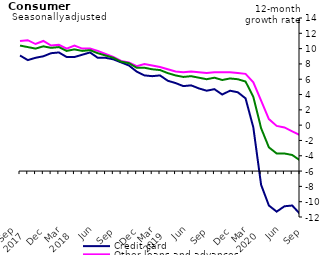
| Category | Credit card | Other loans and advances | Total |
|---|---|---|---|
| Sep 
2017 | 9.1 | 11 | 10.4 |
|  | 8.5 | 11.1 | 10.2 |
|  | 8.8 | 10.6 | 10 |
| Dec | 9 | 11 | 10.3 |
|  | 9.4 | 10.4 | 10.1 |
|  | 9.5 | 10.5 | 10.2 |
| Mar 
2018 | 8.9 | 10 | 9.7 |
|  | 8.9 | 10.4 | 9.9 |
|  | 9.2 | 10 | 9.7 |
| Jun | 9.5 | 10 | 9.8 |
|  | 8.8 | 9.7 | 9.4 |
|  | 8.8 | 9.3 | 9.1 |
| Sep | 8.6 | 8.9 | 8.8 |
|  | 8.2 | 8.4 | 8.3 |
|  | 7.8 | 8.2 | 8.1 |
| Dec | 7 | 7.7 | 7.5 |
|  | 6.5 | 8 | 7.5 |
|  | 6.4 | 7.8 | 7.3 |
| Mar 
2019 | 6.5 | 7.6 | 7.2 |
|  | 5.8 | 7.3 | 6.8 |
|  | 5.5 | 7 | 6.5 |
| Jun | 5.1 | 6.9 | 6.3 |
|  | 5.2 | 7 | 6.4 |
|  | 4.8 | 6.9 | 6.2 |
| Sep | 4.5 | 6.8 | 6 |
|  | 4.7 | 6.9 | 6.2 |
|  | 4 | 6.9 | 5.9 |
| Dec | 4.5 | 6.9 | 6.1 |
|  | 4.3 | 6.8 | 6 |
|  | 3.5 | 6.7 | 5.7 |
| Mar 
2020 | -0.3 | 5.6 | 3.7 |
|  | -7.8 | 3.2 | -0.4 |
|  | -10.5 | 0.8 | -2.9 |
| Jun | -11.3 | -0.1 | -3.7 |
|  | -10.6 | -0.3 | -3.7 |
|  | -10.5 | -0.8 | -3.9 |
| Sep | -11.6 | -1.3 | -4.6 |